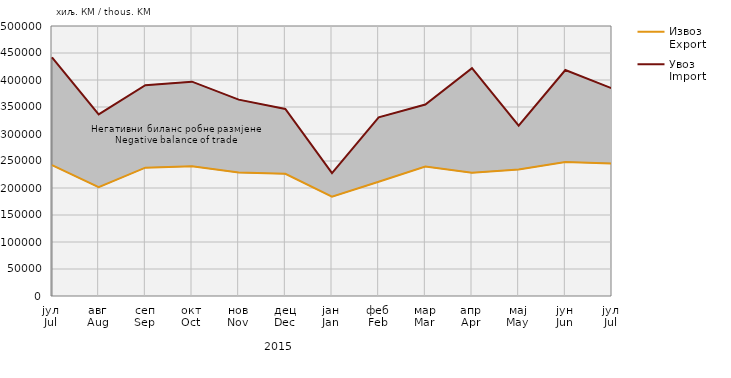
| Category | Извоз
Export | Увоз
Import |
|---|---|---|
| јул
Jul | 242225 | 441833 |
| авг
Aug | 201367 | 336388 |
| сеп
Sep | 237597 | 390273 |
| окт
Oct | 240258 | 396961 |
| нов
Nov | 228539 | 363606 |
| дец
Dec | 226207 | 346357 |
| јан
Jan | 183779 | 227697 |
| феб
Feb | 211524 | 330765 |
| мар
Mar | 239782 | 354491 |
| апр
Apr | 228100 | 421781 |
| мај
May | 234236 | 315411 |
| јун
Jun | 248109 | 418421 |
| јул
Jul | 245480 | 384376 |